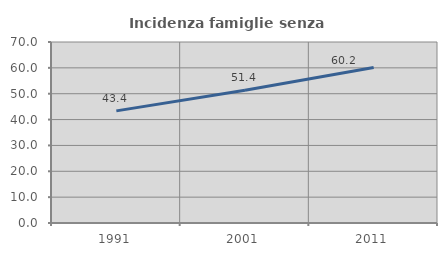
| Category | Incidenza famiglie senza nuclei |
|---|---|
| 1991.0 | 43.363 |
| 2001.0 | 51.376 |
| 2011.0 | 60.169 |